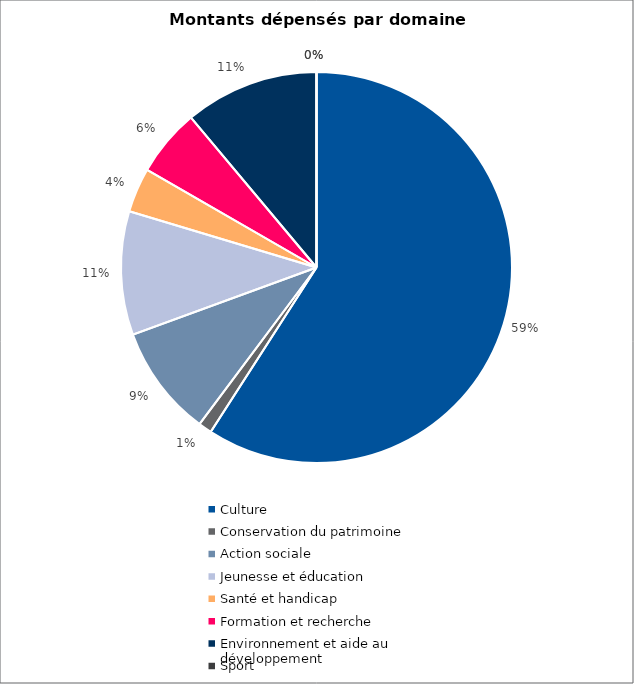
| Category | Series 0 |
|---|---|
| Culture | 17940350 |
| Conservation du patrimoine | 337000 |
| Action sociale | 2796700 |
| Jeunesse et éducation | 3102801 |
| Santé et handicap | 1116600 |
| Formation et recherche | 1695000 |
| Environnement et aide au
développement | 3367900 |
| Sport | 0 |
| Autres projets d’utilité publique | 0 |